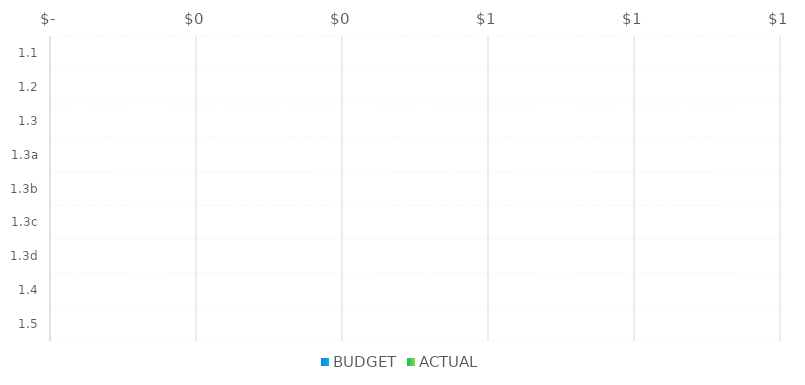
| Category | BUDGET | ACTUAL |
|---|---|---|
| 1.1 |  | 0 |
| 1.2 |  | 0 |
| 1.3 |  | 0 |
| 1.3a |  | 0 |
| 1.3b |  | 0 |
| 1.3c |  | 0 |
| 1.3d |  | 0 |
| 1.4 |  | 0 |
| 1.5 |  | 0 |